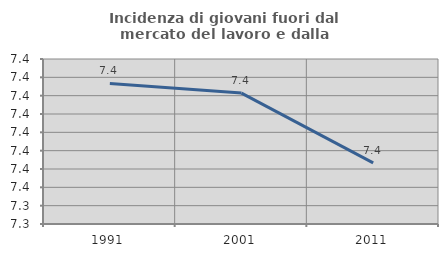
| Category | Incidenza di giovani fuori dal mercato del lavoro e dalla formazione  |
|---|---|
| 1991.0 | 7.378 |
| 2001.0 | 7.376 |
| 2011.0 | 7.357 |